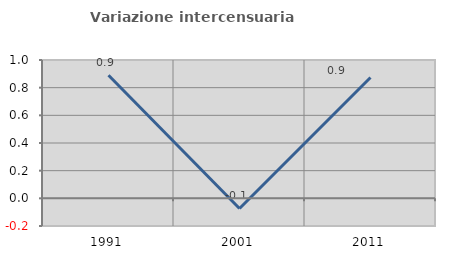
| Category | Variazione intercensuaria annua |
|---|---|
| 1991.0 | 0.89 |
| 2001.0 | -0.073 |
| 2011.0 | 0.873 |